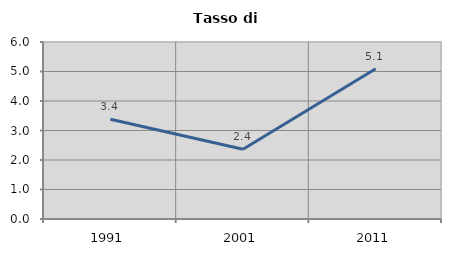
| Category | Tasso di disoccupazione   |
|---|---|
| 1991.0 | 3.378 |
| 2001.0 | 2.362 |
| 2011.0 | 5.096 |